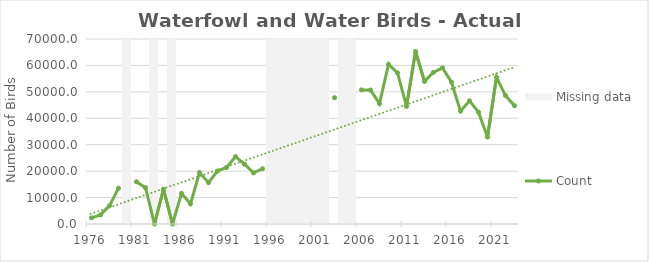
| Category | Missing data |
|---|---|
| 1976.0 | 0 |
| 1977.0 | 0 |
| 1978.0 | 0 |
| 1979.0 | 0 |
| 1980.0 | 1 |
| 1981.0 | 0 |
| 1982.0 | 0 |
| 1983.0 | 1 |
| 1984.0 | 0 |
| 1985.0 | 1 |
| 1986.0 | 0 |
| 1987.0 | 0 |
| 1988.0 | 0 |
| 1989.0 | 0 |
| 1990.0 | 0 |
| 1991.0 | 0 |
| 1992.0 | 0 |
| 1993.0 | 0 |
| 1994.0 | 0 |
| 1995.0 | 0 |
| 1996.0 | 1 |
| 1997.0 | 1 |
| 1998.0 | 1 |
| 1999.0 | 1 |
| 2000.0 | 1 |
| 2001.0 | 1 |
| 2002.0 | 1 |
| 2003.0 | 0 |
| 2004.0 | 1 |
| 2005.0 | 1 |
| 2006.0 | 0 |
| 2007.0 | 0 |
| 2008.0 | 0 |
| 2009.0 | 0 |
| 2010.0 | 0 |
| 2011.0 | 0 |
| 2012.0 | 0 |
| 2013.0 | 0 |
| 2014.0 | 0 |
| 2015.0 | 0 |
| 2016.0 | 0 |
| 2017.0 | 0 |
| 2018.0 | 0 |
| 2019.0 | 0 |
| 2020.0 | 0 |
| 2021.0 | 0 |
| 2022.0 | 0 |
| 2023.0 | 0 |